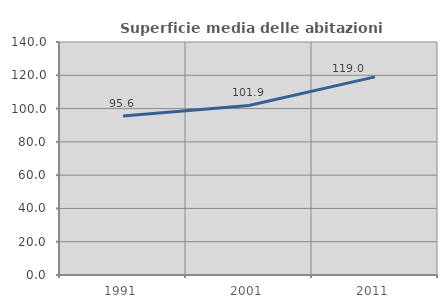
| Category | Superficie media delle abitazioni occupate |
|---|---|
| 1991.0 | 95.606 |
| 2001.0 | 101.893 |
| 2011.0 | 119.048 |